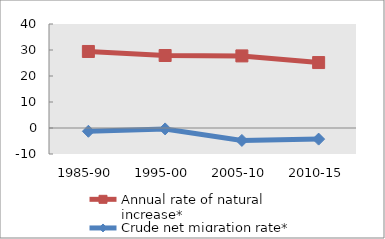
| Category | Annual rate of natural increase* | Crude net migration rate* |
|---|---|---|
| 1985-90 | 29.432 | -1.258 |
| 1995-00 | 27.879 | -0.351 |
| 2005-10 | 27.732 | -4.779 |
| 2010-15 | 25.17 | -4.273 |